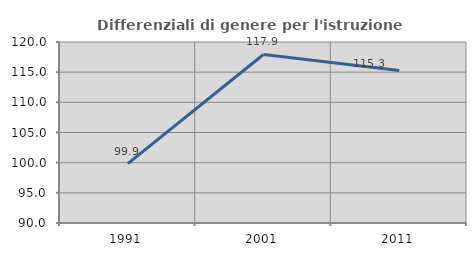
| Category | Differenziali di genere per l'istruzione superiore |
|---|---|
| 1991.0 | 99.852 |
| 2001.0 | 117.933 |
| 2011.0 | 115.279 |